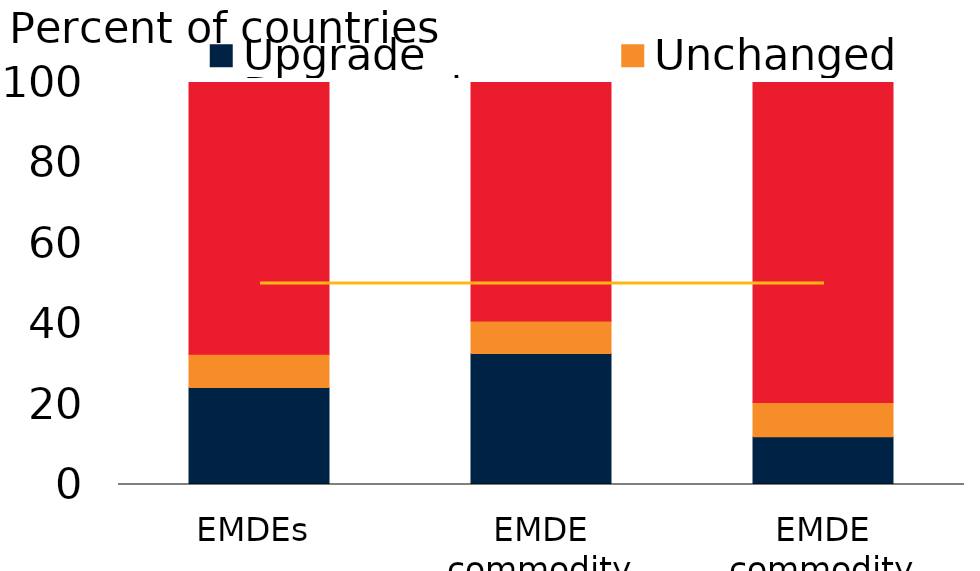
| Category | Upgrade | Unchanged | Downgrade |
|---|---|---|---|
| EMDEs | 24.1 | 8.3 | 67.6 |
| EMDE commodity exporters | 32.6 | 8.1 | 59.3 |
| EMDE commodity importers | 11.9 | 8.5 | 79.7 |